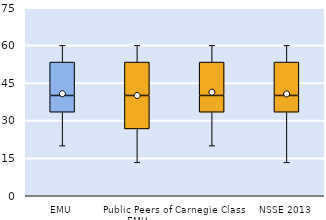
| Category | 25th | 50th | 75th |
|---|---|---|---|
| EMU | 33.333 | 6.667 | 13.333 |
| Public Peers of EMU | 26.667 | 13.333 | 13.333 |
| Carnegie Class | 33.333 | 6.667 | 13.333 |
| NSSE 2013 | 33.333 | 6.667 | 13.333 |